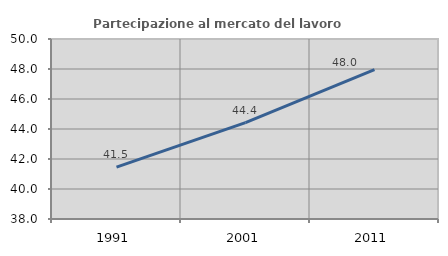
| Category | Partecipazione al mercato del lavoro  femminile |
|---|---|
| 1991.0 | 41.459 |
| 2001.0 | 44.427 |
| 2011.0 | 47.954 |